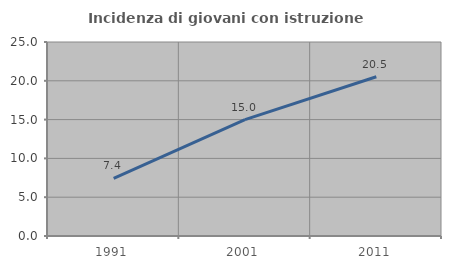
| Category | Incidenza di giovani con istruzione universitaria |
|---|---|
| 1991.0 | 7.438 |
| 2001.0 | 15 |
| 2011.0 | 20.524 |